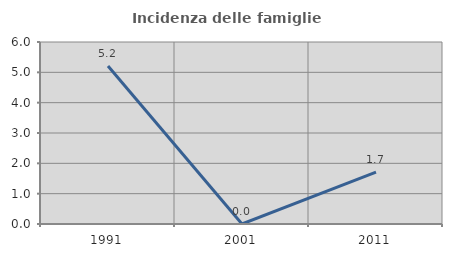
| Category | Incidenza delle famiglie numerose |
|---|---|
| 1991.0 | 5.208 |
| 2001.0 | 0 |
| 2011.0 | 1.709 |